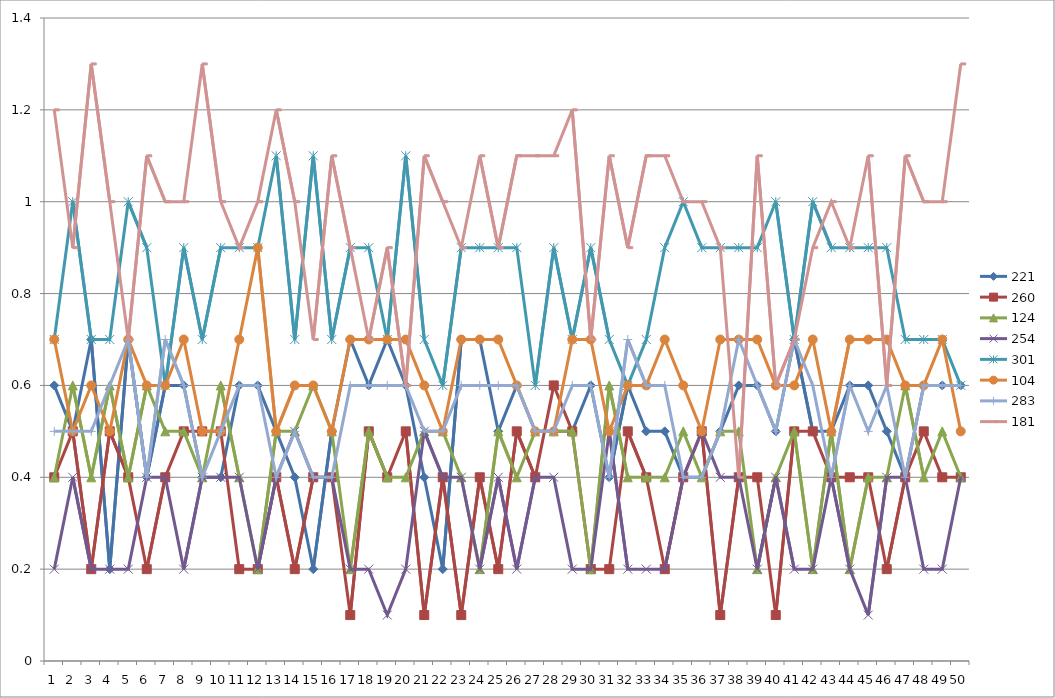
| Category | 221 | 260 | 124 | 254 | 301 | 104 | 283 | 181 |
|---|---|---|---|---|---|---|---|---|
| 0 | 0.6 | 0.4 | 0.4 | 0.2 | 0.7 | 0.7 | 0.5 | 1.2 |
| 1 | 0.5 | 0.5 | 0.6 | 0.4 | 1 | 0.5 | 0.5 | 0.9 |
| 2 | 0.7 | 0.2 | 0.4 | 0.2 | 0.7 | 0.6 | 0.5 | 1.3 |
| 3 | 0.2 | 0.5 | 0.6 | 0.2 | 0.7 | 0.5 | 0.6 | 1 |
| 4 | 0.7 | 0.4 | 0.4 | 0.2 | 1 | 0.7 | 0.7 | 0.7 |
| 5 | 0.4 | 0.2 | 0.6 | 0.4 | 0.9 | 0.6 | 0.4 | 1.1 |
| 6 | 0.6 | 0.4 | 0.5 | 0.4 | 0.6 | 0.6 | 0.7 | 1 |
| 7 | 0.6 | 0.5 | 0.5 | 0.2 | 0.9 | 0.7 | 0.6 | 1 |
| 8 | 0.4 | 0.5 | 0.4 | 0.4 | 0.7 | 0.5 | 0.4 | 1.3 |
| 9 | 0.4 | 0.5 | 0.6 | 0.4 | 0.9 | 0.5 | 0.5 | 1 |
| 10 | 0.6 | 0.2 | 0.4 | 0.4 | 0.9 | 0.7 | 0.6 | 0.9 |
| 11 | 0.6 | 0.2 | 0.2 | 0.2 | 0.9 | 0.9 | 0.6 | 1 |
| 12 | 0.5 | 0.4 | 0.5 | 0.4 | 1.1 | 0.5 | 0.4 | 1.2 |
| 13 | 0.4 | 0.2 | 0.5 | 0.5 | 0.7 | 0.6 | 0.5 | 1 |
| 14 | 0.2 | 0.4 | 0.6 | 0.4 | 1.1 | 0.6 | 0.4 | 0.7 |
| 15 | 0.5 | 0.4 | 0.5 | 0.4 | 0.7 | 0.5 | 0.4 | 1.1 |
| 16 | 0.7 | 0.1 | 0.2 | 0.2 | 0.9 | 0.7 | 0.6 | 0.9 |
| 17 | 0.6 | 0.5 | 0.5 | 0.2 | 0.9 | 0.7 | 0.6 | 0.7 |
| 18 | 0.7 | 0.4 | 0.4 | 0.1 | 0.7 | 0.7 | 0.6 | 0.9 |
| 19 | 0.6 | 0.5 | 0.4 | 0.2 | 1.1 | 0.7 | 0.6 | 0.6 |
| 20 | 0.4 | 0.1 | 0.5 | 0.5 | 0.7 | 0.6 | 0.5 | 1.1 |
| 21 | 0.2 | 0.4 | 0.5 | 0.4 | 0.6 | 0.5 | 0.5 | 1 |
| 22 | 0.7 | 0.1 | 0.4 | 0.4 | 0.9 | 0.7 | 0.6 | 0.9 |
| 23 | 0.7 | 0.4 | 0.2 | 0.2 | 0.9 | 0.7 | 0.6 | 1.1 |
| 24 | 0.5 | 0.2 | 0.5 | 0.4 | 0.9 | 0.7 | 0.6 | 0.9 |
| 25 | 0.6 | 0.5 | 0.4 | 0.2 | 0.9 | 0.6 | 0.6 | 1.1 |
| 26 | 0.5 | 0.4 | 0.5 | 0.4 | 0.6 | 0.5 | 0.5 | 1.1 |
| 27 | 0.5 | 0.6 | 0.5 | 0.4 | 0.9 | 0.5 | 0.5 | 1.1 |
| 28 | 0.5 | 0.5 | 0.5 | 0.2 | 0.7 | 0.7 | 0.6 | 1.2 |
| 29 | 0.6 | 0.2 | 0.2 | 0.2 | 0.9 | 0.7 | 0.6 | 0.7 |
| 30 | 0.4 | 0.2 | 0.6 | 0.5 | 0.7 | 0.5 | 0.4 | 1.1 |
| 31 | 0.6 | 0.5 | 0.4 | 0.2 | 0.6 | 0.6 | 0.7 | 0.9 |
| 32 | 0.5 | 0.4 | 0.4 | 0.2 | 0.7 | 0.6 | 0.6 | 1.1 |
| 33 | 0.5 | 0.2 | 0.4 | 0.2 | 0.9 | 0.7 | 0.6 | 1.1 |
| 34 | 0.4 | 0.4 | 0.5 | 0.4 | 1 | 0.6 | 0.4 | 1 |
| 35 | 0.4 | 0.5 | 0.4 | 0.5 | 0.9 | 0.5 | 0.4 | 1 |
| 36 | 0.5 | 0.1 | 0.5 | 0.4 | 0.9 | 0.7 | 0.5 | 0.9 |
| 37 | 0.6 | 0.4 | 0.5 | 0.4 | 0.9 | 0.7 | 0.7 | 0.4 |
| 38 | 0.6 | 0.4 | 0.2 | 0.2 | 0.9 | 0.7 | 0.6 | 1.1 |
| 39 | 0.5 | 0.1 | 0.4 | 0.4 | 1 | 0.6 | 0.5 | 0.6 |
| 40 | 0.7 | 0.5 | 0.5 | 0.2 | 0.7 | 0.6 | 0.7 | 0.7 |
| 41 | 0.5 | 0.5 | 0.2 | 0.2 | 1 | 0.7 | 0.6 | 0.9 |
| 42 | 0.5 | 0.4 | 0.5 | 0.4 | 0.9 | 0.5 | 0.4 | 1 |
| 43 | 0.6 | 0.4 | 0.2 | 0.2 | 0.9 | 0.7 | 0.6 | 0.9 |
| 44 | 0.6 | 0.4 | 0.4 | 0.1 | 0.9 | 0.7 | 0.5 | 1.1 |
| 45 | 0.5 | 0.2 | 0.4 | 0.4 | 0.9 | 0.7 | 0.6 | 0.6 |
| 46 | 0.4 | 0.4 | 0.6 | 0.4 | 0.7 | 0.6 | 0.4 | 1.1 |
| 47 | 0.6 | 0.5 | 0.4 | 0.2 | 0.7 | 0.6 | 0.6 | 1 |
| 48 | 0.6 | 0.4 | 0.5 | 0.2 | 0.7 | 0.7 | 0.6 | 1 |
| 49 | 0.6 | 0.4 | 0.4 | 0.4 | 0.6 | 0.5 | 0.6 | 1.3 |